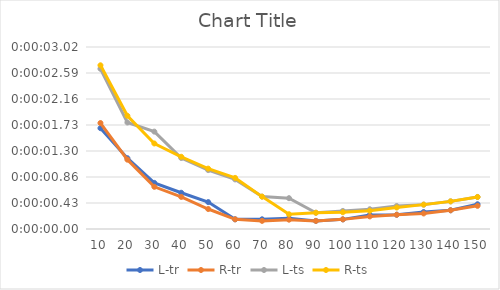
| Category | L-tr | R-tr | L-ts | R-ts |
|---|---|---|---|---|
| 10.0 | 0 | 0 | 0 | 0 |
| 20.0 | 0 | 0 | 0 | 0 |
| 30.0 | 0 | 0 | 0 | 0 |
| 40.0 | 0 | 0 | 0 | 0 |
| 50.0 | 0 | 0 | 0 | 0 |
| 60.0 | 0 | 0 | 0 | 0 |
| 70.0 | 0 | 0 | 0 | 0 |
| 80.0 | 0 | 0 | 0 | 0 |
| 90.0 | 0 | 0 | 0 | 0 |
| 100.0 | 0 | 0 | 0 | 0 |
| 110.0 | 0 | 0 | 0 | 0 |
| 120.0 | 0 | 0 | 0 | 0 |
| 130.0 | 0 | 0 | 0 | 0 |
| 140.0 | 0 | 0 | 0 | 0 |
| 150.0 | 0 | 0 | 0 | 0 |